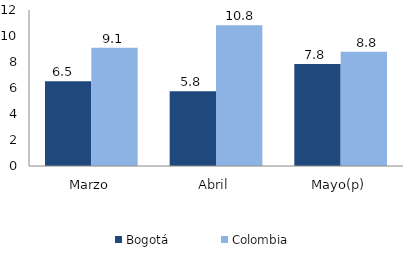
| Category | Bogotá | Colombia |
|---|---|---|
| Marzo | 6.521 | 9.089 |
| Abril | 5.753 | 10.832 |
| Mayo(p) | 7.849 | 8.787 |